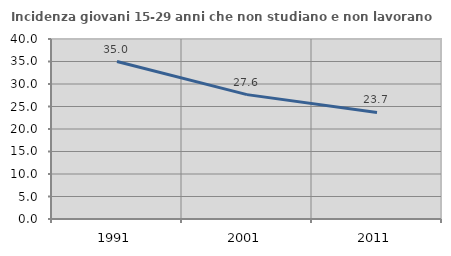
| Category | Incidenza giovani 15-29 anni che non studiano e non lavorano  |
|---|---|
| 1991.0 | 35 |
| 2001.0 | 27.637 |
| 2011.0 | 23.684 |